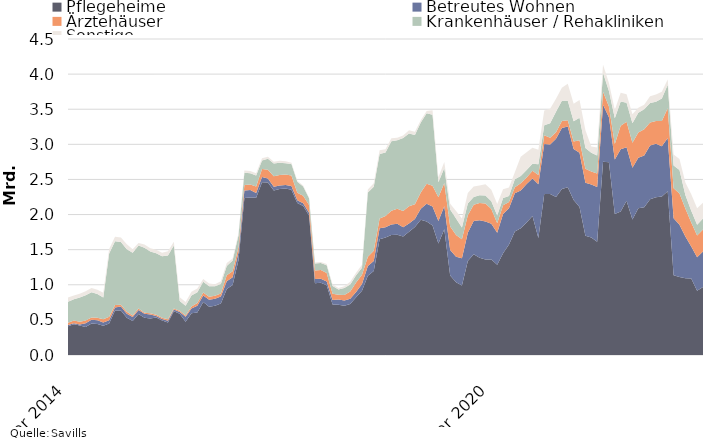
| Category | Pflegeheime | Betreutes Wohnen | Ärztehäuser | Krankenhäuser / Rehakliniken | Sonstige |
|---|---|---|---|---|---|
| 2014-03-01 | 409587999 | 16996000 | 33896100 | 297467994 | 60915344 |
| 2014-04-01 | 436479999 | 16996000 | 38896100 | 299927994 | 54915344 |
| 2014-05-01 | 420451999 | 12372000 | 38896100 | 345627991 | 54915344 |
| 2014-06-01 | 400251999 | 53047000 | 38896100 | 360127987 | 54915344 |
| 2014-07-01 | 447606996 | 53047000 | 35000000 | 357127989 | 63009744 |
| 2014-08-01 | 442116996 | 53047000 | 35000000 | 337739742 | 63009744 |
| 2014-09-01 | 416316995 | 46247000 | 47499999 | 307299740 | 67509743 |
| 2014-10-01 | 450246995 | 46247000 | 47499999 | 901299740 | 65760544 |
| 2014-11-01 | 633736081 | 43759854 | 35999999 | 904699738 | 65760544 |
| 2014-12-01 | 633736081 | 57759854 | 25749999 | 891599738 | 64340644 |
| 2015-01-01 | 530736081 | 57759854 | 25749999 | 891599738 | 71465644 |
| 2015-02-01 | 483168082 | 57759854 | 20749999 | 896099737 | 47465644 |
| 2015-03-01 | 584248082 | 57759854 | 20749999 | 897080987 | 35574599 |
| 2015-04-01 | 529356082 | 57759854 | 15749999 | 924420986 | 46426599 |
| 2015-05-01 | 520608080 | 57759854 | 15749999 | 878720989 | 46426599 |
| 2015-06-01 | 533256112 | 23084854 | 15749999 | 876900990 | 49446599 |
| 2015-07-01 | 490421115 | 23084854 | 15749999 | 875398489 | 52902199 |
| 2015-08-01 | 463331115 | 23084854 | 22535999 | 907658735 | 59202199 |
| 2015-09-01 | 621256115 | 25684854 | 16839999 | 894158738 | 54702200 |
| 2015-10-01 | 587326115 | 25684854 | 16839999 | 139658736 | 52047000 |
| 2015-11-01 | 471877887 | 72825922 | 16839999 | 139508737 | 52047000 |
| 2015-12-01 | 593556246 | 68890922 | 27614999 | 157908739 | 52496999 |
| 2016-01-01 | 606656246 | 93190922 | 41614999 | 153408740 | 50721998 |
| 2016-02-01 | 754539246 | 93190922 | 41614999 | 153858740 | 39721998 |
| 2016-03-01 | 687824246 | 98850422 | 41614999 | 149377489 | 39721998 |
| 2016-04-01 | 701548246 | 98850422 | 41614999 | 136827489 | 28869998 |
| 2016-05-01 | 734016248 | 98850422 | 41614999 | 136827489 | 37869998 |
| 2016-06-01 | 941523216 | 109570422 | 83842999 | 134147490 | 39449998 |
| 2016-07-01 | 997563216 | 109570422 | 83842999 | 153319989 | 28209997 |
| 2016-08-01 | 1353063216 | 109570422 | 80368999 | 163139991 | 26909995 |
| 2016-09-01 | 2236038217 | 106970422 | 78890000 | 174533091 | 31909995 |
| 2016-10-01 | 2242038217 | 106970422 | 78890000 | 160033093 | 30909995 |
| 2016-11-01 | 2237654905 | 70446953 | 92390000 | 156208094 | 32409994 |
| 2016-12-01 | 2458976545 | 74801952 | 115752000 | 118658093 | 33459994 |
| 2017-01-01 | 2457326544 | 55001951 | 125059800 | 158158090 | 28109995 |
| 2017-02-01 | 2342511544 | 55001951 | 149359800 | 178733089 | 28109995 |
| 2017-03-01 | 2363283207 | 49342451 | 149359800 | 177233090 | 28109995 |
| 2017-04-01 | 2371659207 | 49792450 | 149359800 | 159983091 | 28109995 |
| 2017-05-01 | 2351709207 | 54792450 | 149359800 | 164483090 | 19109995 |
| 2017-06-01 | 2165904207 | 38072450 | 107131800 | 154483091 | 16259995 |
| 2017-07-01 | 2122064206 | 38072450 | 107131800 | 133313092 | 14749996 |
| 2017-08-01 | 1987264211 | 38072450 | 111838800 | 93893091 | 9749998 |
| 2017-09-01 | 1022249210 | 59156450 | 121613798 | 101239339 | 11749996 |
| 2017-10-01 | 1028249210 | 59156450 | 122794094 | 101239339 | 11749996 |
| 2017-11-01 | 993351664 | 51823997 | 121994094 | 110189339 | 19607117 |
| 2017-12-01 | 717528269.65 | 64485392.34 | 91375634 | 109439340 | 20394618 |
| 2018-01-01 | 716093269.65 | 73735393.34 | 68067834 | 74639342 | 22894617 |
| 2018-02-01 | 702731268.65 | 75083233.34 | 76967834 | 100209344 | 22894617 |
| 2018-03-01 | 726239605.65 | 75083233.34 | 101967834 | 100209344 | 37894617 |
| 2018-04-01 | 823219606.65 | 74633234.34 | 134166234 | 102309343 | 37894617 |
| 2018-05-01 | 915642106.65 | 94273234.34 | 134166234 | 97809344 | 43894617 |
| 2018-06-01 | 1127762106.65 | 138273234.34 | 134166234 | 912809344 | 42144617 |
| 2018-07-01 | 1195392105.65 | 143673234.34 | 145666234 | 910309345 | 51944617 |
| 2018-08-01 | 1648382098.65 | 157723234.34 | 137647234 | 919564346 | 51944617 |
| 2018-09-01 | 1672277099.66 | 147639234.34 | 158043236 | 907324998 | 44944619 |
| 2018-10-01 | 1707357099.66 | 151089234.34 | 195391740 | 988324994 | 44944619 |
| 2018-11-01 | 1711797099.66 | 155979234.34 | 214712300 | 974149994 | 37837498 |
| 2018-12-01 | 1689070494.01 | 128897840 | 232943760 | 1040049993 | 35549998 |
| 2019-01-01 | 1756635495.01 | 115597839 | 246203760 | 1035349994 | 46839999 |
| 2019-02-01 | 1821157496.01 | 114249999 | 213003760 | 985490494 | 46839999 |
| 2019-03-01 | 1925204184.01 | 156848310 | 233003760 | 994090494 | 33089999 |
| 2019-04-01 | 1902076683.01 | 251948310 | 285155359 | 1002880494 | 33089999 |
| 2019-05-01 | 1844150183.01 | 271883310 | 295091359 | 1009130493 | 65889999 |
| 2019-06-01 | 1589330183.01 | 317883310 | 338910558 | 213630492 | 71139999 |
| 2019-07-01 | 1791050185.01 | 326550262 | 332410558 | 213630492 | 83739997 |
| 2019-08-01 | 1133390186.01 | 363547512 | 332410558 | 240875492 | 83739997 |
| 2019-09-01 | 1035775186 | 363547512 | 308580808 | 235521492 | 105439996 |
| 2019-10-01 | 988695186 | 389797512 | 270052008 | 166221496 | 128973996 |
| 2019-11-01 | 1337476185 | 403512512 | 250531448 | 166518696 | 147173996 |
| 2019-12-01 | 1436021186 | 471912512 | 231531448 | 110118696 | 150234746 |
| 2020-01-01 | 1386087141 | 533140013 | 245211448 | 110118696 | 137444745 |
| 2020-02-01 | 1358892933.36 | 541184833 | 256248136 | 114033196 | 162444745 |
| 2020-03-01 | 1359571245.36 | 509586522 | 211248136 | 109933195 | 164594745 |
| 2020-04-01 | 1285138745.36 | 455118522 | 136898136 | 108543196 | 164594745 |
| 2020-05-01 | 1447483164.36 | 559543521.96 | 126962136 | 102293197 | 125794745 |
| 2020-06-01 | 1572243164.36 | 518143521.96 | 89556937 | 82793198 | 124044744 |
| 2020-07-01 | 1757903270.73 | 545381569.96 | 84556937 | 113523198 | 101644746 |
| 2020-08-01 | 1803513271.73 | 538816589.45 | 102061337 | 103523197 | 274144745 |
| 2020-09-01 | 1888440256.54 | 547632192.28 | 90395087 | 109677196 | 252444746 |
| 2020-10-01 | 1978180292 | 533682192.28 | 111995087 | 97977196 | 228910746 |
| 2020-11-01 | 1665039293 | 767307192.28 | 130112487 | 152879995 | 208460747 |
| 2020-12-01 | 2294464292.86 | 710807192.28 | 124112487 | 143379996 | 207709997 |
| 2021-01-01 | 2291797829.77 | 704629692.28 | 97172487 | 205879995 | 206709998 |
| 2021-02-01 | 2251486125.17 | 827692871.28 | 93575799 | 290996995 | 185699998 |
| 2021-03-01 | 2364136125.17 | 868373933.64 | 100275799 | 286496996 | 184924998 |
| 2021-04-01 | 2389616124.17 | 864137936.64 | 90275800 | 276996996 | 240479998 |
| 2021-05-01 | 2208345705.17 | 724537936.68 | 108436800 | 287996996 | 249129998 |
| 2021-06-01 | 2107366705.17 | 772837936.68 | 176636800 | 321096995 | 253629997 |
| 2021-07-01 | 1698576598.8 | 753200536.68 | 199216800 | 296675495 | 253629997 |
| 2021-08-01 | 1673497598.8 | 755702523.19 | 185212400 | 265675496 | 87993998 |
| 2021-09-01 | 1610965613.99 | 782639920.36 | 190342400 | 258375497 | 111193997 |
| 2021-10-01 | 2750841584.78 | 812109920.36 | 184742400 | 269475497 | 114793997 |
| 2021-11-01 | 2745941584.78 | 639669920.36 | 154125000 | 219275497 | 114793997 |
| 2021-12-01 | 2006821584.92 | 777519920.36 | 221765800 | 364207997 | 118483997 |
| 2022-01-01 | 2042127093.01 | 886132354.36 | 337795799 | 344707998 | 122995997 |
| 2022-02-01 | 2196388858.57 | 762224355.36 | 361855798 | 271440998 | 120005996 |
| 2022-03-01 | 1928563857.57 | 739468293 | 355155798 | 276440998 | 127580995 |
| 2022-04-01 | 2088421001.57 | 719072290 | 361030798 | 279620998 | 72025995 |
| 2022-05-01 | 2102802501.57 | 737309790 | 373877298 | 286620998 | 63375995 |
| 2022-06-01 | 2216266501.57 | 768629139 | 324546350.59 | 278245999 | 95975997 |
| 2022-07-01 | 2244765054.57 | 762589744 | 326355100.59 | 271937499 | 103652497 |
| 2022-08-01 | 2257556327.57 | 715605488 | 358855100.59 | 320237499 | 96788497 |
| 2022-09-01 | 2331781592.07 | 760059931.47 | 423725100.57 | 332737499 | 73588498 |
| 2022-10-01 | 1135340585.82 | 811976096.45 | 428725100.57 | 321637499 | 157293498 |
| 2022-11-01 | 1111825545.82 | 744216096.45 | 442525100.57 | 336637500 | 157293498 |
| 2022-12-01 | 1093347679.82 | 594466096.45 | 397384300.57 | 193505000 | 176293498 |
| 2023-01-01 | 1090322679.82 | 454293662.45 | 341155301.57 | 170004998 | 235031498 |
| 2023-02-01 | 914306826.5 | 476193662.45 | 312254502.57 | 153004998 | 234031499 |
| 2023-03-01 | 968021827.5 | 505160662.45 | 312254502.57 | 160127498 | 223831500 |